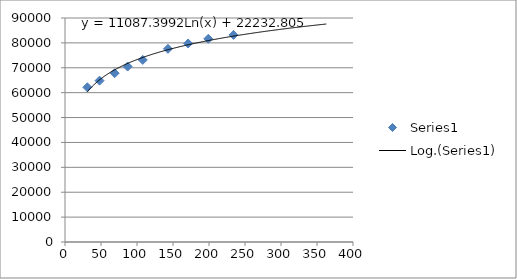
| Category | Series 0 |
|---|---|
| 31.0 | 62156 |
| 48.0 | 64831 |
| 69.0 | 67811 |
| 87.0 | 70486 |
| 108.0 | 73156 |
| 143.0 | 77615 |
| 171.0 | 79763 |
| 199.0 | 81649 |
| 234.0 | 83204 |